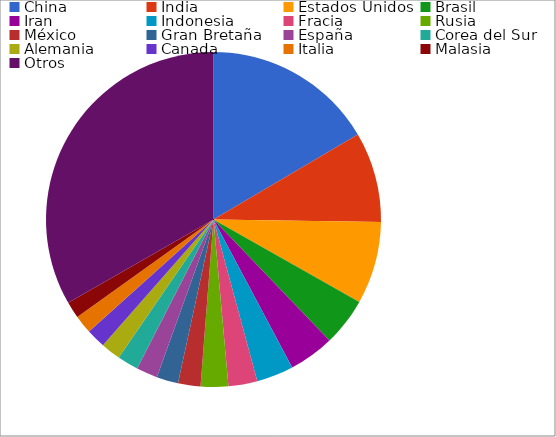
| Category | Series 0 |
|---|---|
| China | 16.529 |
| India | 8.711 |
| Estados Unidos | 7.948 |
| Brasil | 4.643 |
| Iran | 4.388 |
| Indonesia | 3.567 |
| Fracia | 2.789 |
| Rusia | 2.66 |
| México | 2.168 |
| Gran Bretaña | 2.088 |
| España | 2.048 |
| Corea del Sur | 2.03 |
| Alemania | 1.91 |
| Canada | 1.862 |
| Italia | 1.774 |
| Malasia | 1.593 |
| Otros | 33.292 |